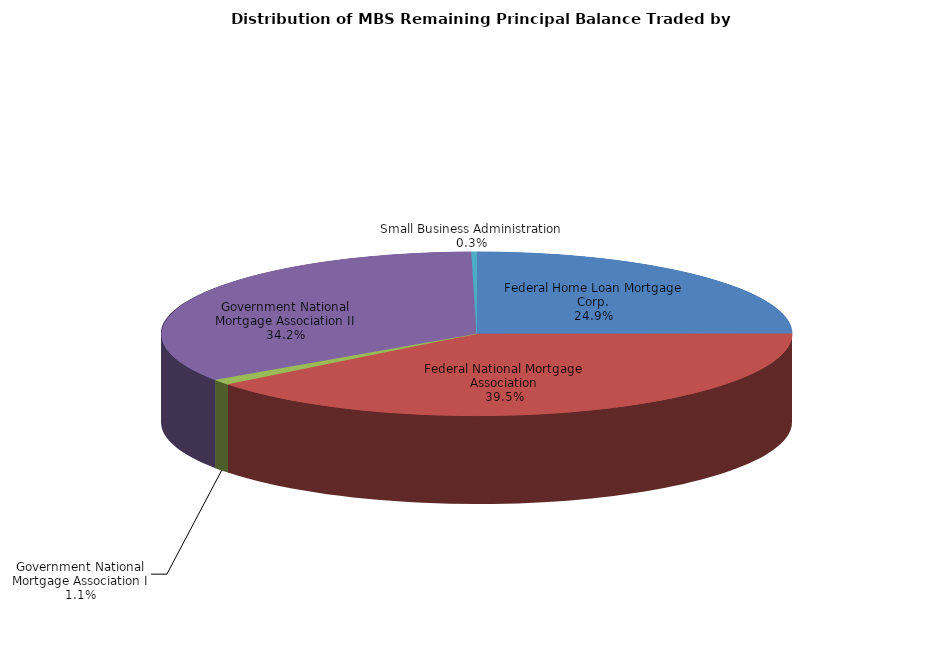
| Category | Series 0 |
|---|---|
| Federal Home Loan Mortgage Corp. | 3660162592.202 |
| Federal National Mortgage Association | 5803859039.439 |
| Government National Mortgage Association I | 157982904.251 |
| Government National Mortgage Association II | 5027346044.232 |
| Small Business Administration | 38974129.746 |